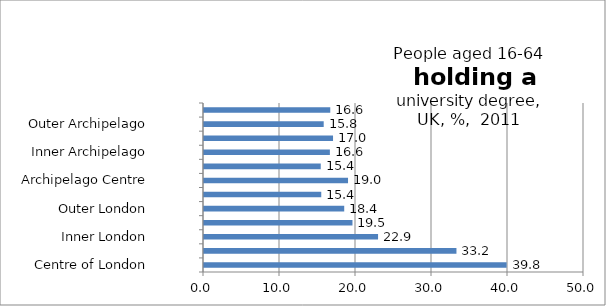
| Category | Series 0 |
|---|---|
| Centre of London | 39.818 |
| London Core | 33.217 |
| Inner London | 22.903 |
| London Suburbs | 19.534 |
| Outer London | 18.45 |
| London Edge | 15.429 |
| Archipelago Centre | 18.952 |
| Archipelago Core | 15.36 |
| Inner Archipelago | 16.563 |
| Archipelago Suburbs | 16.979 |
| Outer Archipelago | 15.75 |
| Archipelago Edge | 16.614 |